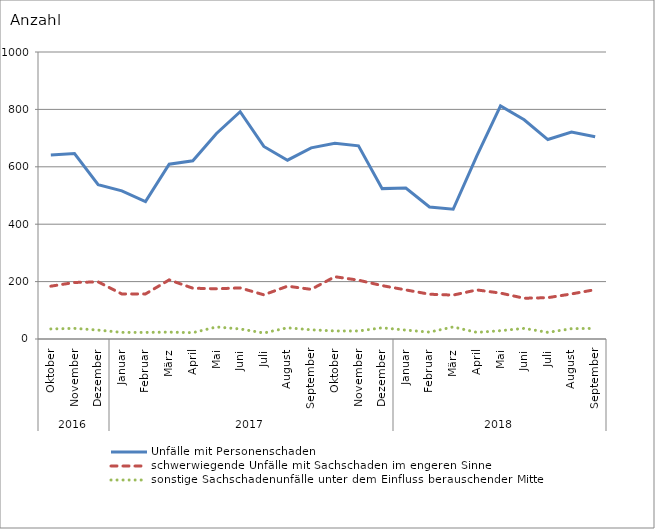
| Category | Unfälle mit Personenschaden | schwerwiegende Unfälle mit Sachschaden im engeren Sinne | sonstige Sachschadenunfälle unter dem Einfluss berauschender Mittel |
|---|---|---|---|
| 0 | 641 | 184 | 35 |
| 1 | 646 | 197 | 37 |
| 2 | 538 | 199 | 31 |
| 3 | 516 | 157 | 23 |
| 4 | 479 | 157 | 23 |
| 5 | 609 | 206 | 24 |
| 6 | 621 | 177 | 22 |
| 7 | 716 | 175 | 42 |
| 8 | 792 | 178 | 35 |
| 9 | 671 | 154 | 21 |
| 10 | 623 | 184 | 39 |
| 11 | 666 | 173 | 32 |
| 12 | 682 | 217 | 28 |
| 13 | 673 | 205 | 28 |
| 14 | 524 | 186 | 39 |
| 15 | 526 | 171 | 31 |
| 16 | 460 | 156 | 24 |
| 17 | 452 | 153 | 42 |
| 18 | 638 | 171 | 23 |
| 19 | 812 | 160 | 29 |
| 20 | 764 | 142 | 37 |
| 21 | 695 | 144 | 23 |
| 22 | 721 | 157 | 36 |
| 23 | 705 | 172 | 37 |